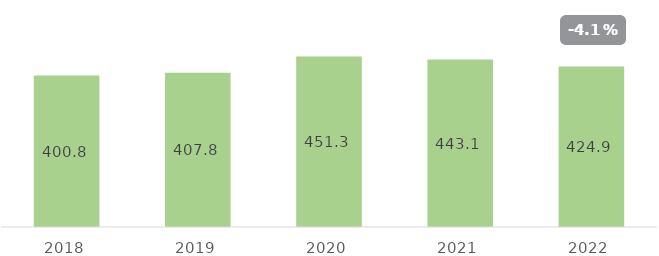
| Category | Quantitativo |
|---|---|
| 2018.0 | 400.845 |
| 2019.0 | 407.764 |
| 2020.0 | 451.338 |
| 2021.0 | 443.127 |
| 2022.0 | 424.858 |